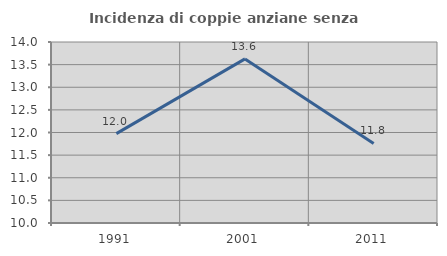
| Category | Incidenza di coppie anziane senza figli  |
|---|---|
| 1991.0 | 11.975 |
| 2001.0 | 13.626 |
| 2011.0 | 11.758 |